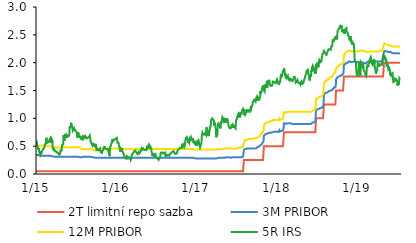
| Category | 2T limitní repo sazba | 3M PRIBOR | 12M PRIBOR | 5R IRS |
|---|---|---|---|---|
| 2015-01-02 | 0.05 | 0.34 | 0.51 | 0.55 |
| 2015-01-05 | 0.05 | 0.34 | 0.51 | 0.57 |
| 2015-01-06 | 0.05 | 0.34 | 0.51 | 0.54 |
| 2015-01-07 | 0.05 | 0.34 | 0.51 | 0.51 |
| 2015-01-08 | 0.05 | 0.34 | 0.51 | 0.52 |
| 2015-01-09 | 0.05 | 0.34 | 0.51 | 0.49 |
| 2015-01-12 | 0.05 | 0.34 | 0.51 | 0.48 |
| 2015-01-13 | 0.05 | 0.33 | 0.51 | 0.44 |
| 2015-01-14 | 0.05 | 0.33 | 0.51 | 0.46 |
| 2015-01-15 | 0.05 | 0.33 | 0.51 | 0.45 |
| 2015-01-16 | 0.05 | 0.33 | 0.51 | 0.4 |
| 2015-01-19 | 0.05 | 0.33 | 0.51 | 0.4 |
| 2015-01-20 | 0.05 | 0.33 | 0.51 | 0.36 |
| 2015-01-21 | 0.05 | 0.33 | 0.51 | 0.38 |
| 2015-01-22 | 0.05 | 0.33 | 0.51 | 0.41 |
| 2015-01-23 | 0.05 | 0.33 | 0.51 | 0.35 |
| 2015-01-26 | 0.05 | 0.33 | 0.51 | 0.36 |
| 2015-01-27 | 0.05 | 0.33 | 0.51 | 0.38 |
| 2015-01-28 | 0.05 | 0.33 | 0.51 | 0.4 |
| 2015-01-29 | 0.05 | 0.33 | 0.51 | 0.41 |
| 2015-01-30 | 0.05 | 0.33 | 0.51 | 0.42 |
| 2015-02-02 | 0.05 | 0.33 | 0.51 | 0.41 |
| 2015-02-03 | 0.05 | 0.33 | 0.51 | 0.41 |
| 2015-02-04 | 0.05 | 0.33 | 0.51 | 0.45 |
| 2015-02-05 | 0.05 | 0.33 | 0.51 | 0.46 |
| 2015-02-06 | 0.05 | 0.33 | 0.51 | 0.46 |
| 2015-02-09 | 0.05 | 0.33 | 0.51 | 0.48 |
| 2015-02-10 | 0.05 | 0.33 | 0.51 | 0.49 |
| 2015-02-11 | 0.05 | 0.33 | 0.51 | 0.53 |
| 2015-02-12 | 0.05 | 0.33 | 0.51 | 0.54 |
| 2015-02-13 | 0.05 | 0.33 | 0.51 | 0.53 |
| 2015-02-16 | 0.05 | 0.33 | 0.51 | 0.55 |
| 2015-02-17 | 0.05 | 0.33 | 0.51 | 0.58 |
| 2015-02-18 | 0.05 | 0.33 | 0.51 | 0.65 |
| 2015-02-19 | 0.05 | 0.33 | 0.51 | 0.55 |
| 2015-02-20 | 0.05 | 0.33 | 0.5 | 0.6 |
| 2015-02-23 | 0.05 | 0.33 | 0.5 | 0.61 |
| 2015-02-24 | 0.05 | 0.33 | 0.5 | 0.61 |
| 2015-02-25 | 0.05 | 0.33 | 0.5 | 0.57 |
| 2015-02-26 | 0.05 | 0.33 | 0.5 | 0.57 |
| 2015-02-27 | 0.05 | 0.33 | 0.5 | 0.57 |
| 2015-03-02 | 0.05 | 0.33 | 0.5 | 0.58 |
| 2015-03-03 | 0.05 | 0.33 | 0.5 | 0.57 |
| 2015-03-04 | 0.05 | 0.33 | 0.5 | 0.62 |
| 2015-03-05 | 0.05 | 0.33 | 0.5 | 0.62 |
| 2015-03-06 | 0.05 | 0.33 | 0.5 | 0.62 |
| 2015-03-09 | 0.05 | 0.33 | 0.5 | 0.65 |
| 2015-03-10 | 0.05 | 0.33 | 0.5 | 0.62 |
| 2015-03-11 | 0.05 | 0.33 | 0.5 | 0.62 |
| 2015-03-12 | 0.05 | 0.33 | 0.5 | 0.56 |
| 2015-03-13 | 0.05 | 0.33 | 0.5 | 0.63 |
| 2015-03-16 | 0.05 | 0.32 | 0.49 | 0.61 |
| 2015-03-17 | 0.05 | 0.32 | 0.49 | 0.59 |
| 2015-03-18 | 0.05 | 0.31 | 0.49 | 0.5 |
| 2015-03-19 | 0.05 | 0.31 | 0.48 | 0.45 |
| 2015-03-20 | 0.05 | 0.31 | 0.48 | 0.44 |
| 2015-03-23 | 0.05 | 0.31 | 0.48 | 0.46 |
| 2015-03-24 | 0.05 | 0.31 | 0.48 | 0.44 |
| 2015-03-25 | 0.05 | 0.31 | 0.48 | 0.43 |
| 2015-03-26 | 0.05 | 0.31 | 0.48 | 0.41 |
| 2015-03-27 | 0.05 | 0.31 | 0.48 | 0.43 |
| 2015-03-30 | 0.05 | 0.31 | 0.48 | 0.41 |
| 2015-03-31 | 0.05 | 0.31 | 0.48 | 0.41 |
| 2015-04-01 | 0.05 | 0.31 | 0.48 | 0.41 |
| 2015-04-02 | 0.05 | 0.31 | 0.48 | 0.4 |
| 2015-04-03 | 0.05 | 0.31 | 0.48 | 0.4 |
| 2015-04-07 | 0.05 | 0.31 | 0.48 | 0.39 |
| 2015-04-08 | 0.05 | 0.31 | 0.48 | 0.39 |
| 2015-04-09 | 0.05 | 0.31 | 0.48 | 0.38 |
| 2015-04-10 | 0.05 | 0.31 | 0.48 | 0.38 |
| 2015-04-13 | 0.05 | 0.31 | 0.48 | 0.37 |
| 2015-04-14 | 0.05 | 0.31 | 0.47 | 0.37 |
| 2015-04-15 | 0.05 | 0.31 | 0.48 | 0.37 |
| 2015-04-16 | 0.05 | 0.31 | 0.47 | 0.35 |
| 2015-04-17 | 0.05 | 0.31 | 0.47 | 0.36 |
| 2015-04-20 | 0.05 | 0.31 | 0.47 | 0.35 |
| 2015-04-21 | 0.05 | 0.31 | 0.47 | 0.36 |
| 2015-04-22 | 0.05 | 0.31 | 0.47 | 0.38 |
| 2015-04-23 | 0.05 | 0.31 | 0.48 | 0.42 |
| 2015-04-24 | 0.05 | 0.31 | 0.47 | 0.42 |
| 2015-04-27 | 0.05 | 0.31 | 0.48 | 0.41 |
| 2015-04-28 | 0.05 | 0.31 | 0.48 | 0.42 |
| 2015-04-29 | 0.05 | 0.31 | 0.48 | 0.47 |
| 2015-04-30 | 0.05 | 0.31 | 0.48 | 0.52 |
| 2015-05-04 | 0.05 | 0.31 | 0.48 | 0.53 |
| 2015-05-05 | 0.05 | 0.31 | 0.48 | 0.53 |
| 2015-05-06 | 0.05 | 0.31 | 0.48 | 0.59 |
| 2015-05-07 | 0.05 | 0.31 | 0.48 | 0.7 |
| 2015-05-11 | 0.05 | 0.31 | 0.48 | 0.6 |
| 2015-05-12 | 0.05 | 0.31 | 0.48 | 0.69 |
| 2015-05-13 | 0.05 | 0.31 | 0.48 | 0.66 |
| 2015-05-14 | 0.05 | 0.31 | 0.48 | 0.72 |
| 2015-05-15 | 0.05 | 0.31 | 0.48 | 0.7 |
| 2015-05-18 | 0.05 | 0.31 | 0.48 | 0.7 |
| 2015-05-19 | 0.05 | 0.31 | 0.48 | 0.65 |
| 2015-05-20 | 0.05 | 0.31 | 0.48 | 0.68 |
| 2015-05-21 | 0.05 | 0.31 | 0.48 | 0.7 |
| 2015-05-22 | 0.05 | 0.31 | 0.48 | 0.7 |
| 2015-05-25 | 0.05 | 0.31 | 0.48 | 0.7 |
| 2015-05-26 | 0.05 | 0.31 | 0.48 | 0.67 |
| 2015-05-27 | 0.05 | 0.31 | 0.48 | 0.67 |
| 2015-05-28 | 0.05 | 0.31 | 0.48 | 0.66 |
| 2015-05-29 | 0.05 | 0.31 | 0.48 | 0.68 |
| 2015-06-01 | 0.05 | 0.31 | 0.48 | 0.69 |
| 2015-06-02 | 0.05 | 0.31 | 0.48 | 0.72 |
| 2015-06-03 | 0.05 | 0.31 | 0.48 | 0.75 |
| 2015-06-04 | 0.05 | 0.31 | 0.48 | 0.86 |
| 2015-06-05 | 0.05 | 0.31 | 0.48 | 0.84 |
| 2015-06-08 | 0.05 | 0.31 | 0.48 | 0.84 |
| 2015-06-09 | 0.05 | 0.31 | 0.48 | 0.86 |
| 2015-06-10 | 0.05 | 0.31 | 0.48 | 0.92 |
| 2015-06-11 | 0.05 | 0.31 | 0.48 | 0.92 |
| 2015-06-12 | 0.05 | 0.31 | 0.48 | 0.89 |
| 2015-06-15 | 0.05 | 0.31 | 0.48 | 0.85 |
| 2015-06-16 | 0.05 | 0.31 | 0.48 | 0.82 |
| 2015-06-17 | 0.05 | 0.31 | 0.48 | 0.82 |
| 2015-06-18 | 0.05 | 0.31 | 0.48 | 0.78 |
| 2015-06-19 | 0.05 | 0.31 | 0.48 | 0.77 |
| 2015-06-22 | 0.05 | 0.31 | 0.48 | 0.79 |
| 2015-06-23 | 0.05 | 0.31 | 0.48 | 0.82 |
| 2015-06-24 | 0.05 | 0.31 | 0.48 | 0.8 |
| 2015-06-25 | 0.05 | 0.31 | 0.48 | 0.78 |
| 2015-06-26 | 0.05 | 0.31 | 0.48 | 0.8 |
| 2015-06-29 | 0.05 | 0.31 | 0.48 | 0.8 |
| 2015-06-30 | 0.05 | 0.31 | 0.48 | 0.78 |
| 2015-07-01 | 0.05 | 0.31 | 0.48 | 0.79 |
| 2015-07-02 | 0.05 | 0.31 | 0.48 | 0.79 |
| 2015-07-03 | 0.05 | 0.31 | 0.48 | 0.78 |
| 2015-07-07 | 0.05 | 0.31 | 0.48 | 0.74 |
| 2015-07-08 | 0.05 | 0.31 | 0.47 | 0.68 |
| 2015-07-09 | 0.05 | 0.31 | 0.47 | 0.65 |
| 2015-07-10 | 0.05 | 0.31 | 0.47 | 0.7 |
| 2015-07-13 | 0.05 | 0.31 | 0.48 | 0.75 |
| 2015-07-14 | 0.05 | 0.31 | 0.48 | 0.68 |
| 2015-07-15 | 0.05 | 0.3 | 0.48 | 0.69 |
| 2015-07-16 | 0.05 | 0.3 | 0.48 | 0.67 |
| 2015-07-17 | 0.05 | 0.3 | 0.48 | 0.69 |
| 2015-07-20 | 0.05 | 0.3 | 0.48 | 0.68 |
| 2015-07-21 | 0.05 | 0.3 | 0.48 | 0.66 |
| 2015-07-22 | 0.05 | 0.31 | 0.48 | 0.67 |
| 2015-07-23 | 0.05 | 0.31 | 0.48 | 0.67 |
| 2015-07-24 | 0.05 | 0.3 | 0.48 | 0.64 |
| 2015-07-27 | 0.05 | 0.3 | 0.45 | 0.63 |
| 2015-07-28 | 0.05 | 0.3 | 0.45 | 0.63 |
| 2015-07-29 | 0.05 | 0.3 | 0.45 | 0.66 |
| 2015-07-30 | 0.05 | 0.3 | 0.45 | 0.62 |
| 2015-07-31 | 0.05 | 0.31 | 0.45 | 0.62 |
| 2015-08-03 | 0.05 | 0.31 | 0.45 | 0.62 |
| 2015-08-04 | 0.05 | 0.31 | 0.45 | 0.62 |
| 2015-08-05 | 0.05 | 0.31 | 0.45 | 0.64 |
| 2015-08-06 | 0.05 | 0.31 | 0.45 | 0.68 |
| 2015-08-07 | 0.05 | 0.31 | 0.45 | 0.68 |
| 2015-08-10 | 0.05 | 0.31 | 0.45 | 0.68 |
| 2015-08-11 | 0.05 | 0.31 | 0.45 | 0.67 |
| 2015-08-12 | 0.05 | 0.31 | 0.45 | 0.64 |
| 2015-08-13 | 0.05 | 0.31 | 0.45 | 0.65 |
| 2015-08-14 | 0.05 | 0.31 | 0.45 | 0.68 |
| 2015-08-17 | 0.05 | 0.31 | 0.45 | 0.67 |
| 2015-08-18 | 0.05 | 0.31 | 0.45 | 0.66 |
| 2015-08-19 | 0.05 | 0.31 | 0.45 | 0.65 |
| 2015-08-20 | 0.05 | 0.31 | 0.45 | 0.64 |
| 2015-08-21 | 0.05 | 0.31 | 0.45 | 0.64 |
| 2015-08-24 | 0.05 | 0.31 | 0.45 | 0.63 |
| 2015-08-25 | 0.05 | 0.31 | 0.45 | 0.65 |
| 2015-08-26 | 0.05 | 0.31 | 0.45 | 0.65 |
| 2015-08-27 | 0.05 | 0.31 | 0.45 | 0.66 |
| 2015-08-28 | 0.05 | 0.31 | 0.45 | 0.66 |
| 2015-08-31 | 0.05 | 0.31 | 0.45 | 0.67 |
| 2015-09-01 | 0.05 | 0.31 | 0.45 | 0.68 |
| 2015-09-02 | 0.05 | 0.31 | 0.45 | 0.68 |
| 2015-09-03 | 0.05 | 0.31 | 0.45 | 0.69 |
| 2015-09-04 | 0.05 | 0.31 | 0.45 | 0.65 |
| 2015-09-07 | 0.05 | 0.31 | 0.45 | 0.6 |
| 2015-09-08 | 0.05 | 0.3 | 0.44 | 0.57 |
| 2015-09-09 | 0.05 | 0.3 | 0.44 | 0.57 |
| 2015-09-10 | 0.05 | 0.3 | 0.44 | 0.57 |
| 2015-09-11 | 0.05 | 0.3 | 0.44 | 0.56 |
| 2015-09-14 | 0.05 | 0.3 | 0.44 | 0.52 |
| 2015-09-15 | 0.05 | 0.3 | 0.44 | 0.54 |
| 2015-09-16 | 0.05 | 0.31 | 0.44 | 0.56 |
| 2015-09-17 | 0.05 | 0.31 | 0.44 | 0.57 |
| 2015-09-18 | 0.05 | 0.31 | 0.44 | 0.53 |
| 2015-09-21 | 0.05 | 0.3 | 0.43 | 0.53 |
| 2015-09-22 | 0.05 | 0.3 | 0.43 | 0.51 |
| 2015-09-23 | 0.05 | 0.3 | 0.43 | 0.53 |
| 2015-09-24 | 0.05 | 0.3 | 0.43 | 0.53 |
| 2015-09-25 | 0.05 | 0.29 | 0.42 | 0.53 |
| 2015-09-29 | 0.05 | 0.29 | 0.42 | 0.53 |
| 2015-09-30 | 0.05 | 0.29 | 0.42 | 0.48 |
| 2015-10-01 | 0.05 | 0.29 | 0.42 | 0.53 |
| 2015-10-02 | 0.05 | 0.29 | 0.42 | 0.53 |
| 2015-10-05 | 0.05 | 0.29 | 0.42 | 0.42 |
| 2015-10-06 | 0.05 | 0.29 | 0.42 | 0.46 |
| 2015-10-07 | 0.05 | 0.29 | 0.42 | 0.46 |
| 2015-10-08 | 0.05 | 0.29 | 0.42 | 0.44 |
| 2015-10-09 | 0.05 | 0.29 | 0.42 | 0.44 |
| 2015-10-12 | 0.05 | 0.29 | 0.42 | 0.45 |
| 2015-10-13 | 0.05 | 0.29 | 0.42 | 0.43 |
| 2015-10-14 | 0.05 | 0.29 | 0.42 | 0.43 |
| 2015-10-15 | 0.05 | 0.29 | 0.42 | 0.43 |
| 2015-10-16 | 0.05 | 0.29 | 0.42 | 0.44 |
| 2015-10-19 | 0.05 | 0.29 | 0.42 | 0.46 |
| 2015-10-20 | 0.05 | 0.29 | 0.42 | 0.44 |
| 2015-10-21 | 0.05 | 0.29 | 0.42 | 0.45 |
| 2015-10-22 | 0.05 | 0.29 | 0.42 | 0.42 |
| 2015-10-23 | 0.05 | 0.29 | 0.42 | 0.39 |
| 2015-10-26 | 0.05 | 0.29 | 0.46 | 0.4 |
| 2015-10-27 | 0.05 | 0.29 | 0.45 | 0.38 |
| 2015-10-29 | 0.05 | 0.29 | 0.45 | 0.38 |
| 2015-10-30 | 0.05 | 0.29 | 0.45 | 0.41 |
| 2015-11-02 | 0.05 | 0.29 | 0.45 | 0.43 |
| 2015-11-03 | 0.05 | 0.29 | 0.46 | 0.44 |
| 2015-11-04 | 0.05 | 0.29 | 0.46 | 0.44 |
| 2015-11-05 | 0.05 | 0.29 | 0.46 | 0.44 |
| 2015-11-06 | 0.05 | 0.29 | 0.45 | 0.44 |
| 2015-11-09 | 0.05 | 0.29 | 0.46 | 0.5 |
| 2015-11-10 | 0.05 | 0.29 | 0.46 | 0.46 |
| 2015-11-11 | 0.05 | 0.29 | 0.46 | 0.46 |
| 2015-11-12 | 0.05 | 0.29 | 0.46 | 0.45 |
| 2015-11-13 | 0.05 | 0.29 | 0.46 | 0.46 |
| 2015-11-16 | 0.05 | 0.29 | 0.46 | 0.45 |
| 2015-11-18 | 0.05 | 0.29 | 0.46 | 0.45 |
| 2015-11-19 | 0.05 | 0.29 | 0.46 | 0.44 |
| 2015-11-20 | 0.05 | 0.29 | 0.46 | 0.44 |
| 2015-11-23 | 0.05 | 0.29 | 0.46 | 0.44 |
| 2015-11-24 | 0.05 | 0.29 | 0.46 | 0.44 |
| 2015-11-25 | 0.05 | 0.29 | 0.46 | 0.46 |
| 2015-11-26 | 0.05 | 0.29 | 0.46 | 0.42 |
| 2015-11-27 | 0.05 | 0.29 | 0.45 | 0.42 |
| 2015-11-30 | 0.05 | 0.29 | 0.45 | 0.36 |
| 2015-12-01 | 0.05 | 0.28 | 0.45 | 0.37 |
| 2015-12-02 | 0.05 | 0.28 | 0.45 | 0.32 |
| 2015-12-03 | 0.05 | 0.28 | 0.45 | 0.34 |
| 2015-12-04 | 0.05 | 0.29 | 0.46 | 0.48 |
| 2015-12-07 | 0.05 | 0.29 | 0.46 | 0.5 |
| 2015-12-08 | 0.05 | 0.29 | 0.46 | 0.49 |
| 2015-12-09 | 0.05 | 0.29 | 0.46 | 0.51 |
| 2015-12-10 | 0.05 | 0.29 | 0.46 | 0.54 |
| 2015-12-11 | 0.05 | 0.29 | 0.46 | 0.53 |
| 2015-12-14 | 0.05 | 0.29 | 0.46 | 0.55 |
| 2015-12-15 | 0.05 | 0.29 | 0.46 | 0.61 |
| 2015-12-16 | 0.05 | 0.29 | 0.46 | 0.63 |
| 2015-12-17 | 0.05 | 0.29 | 0.46 | 0.62 |
| 2015-12-18 | 0.05 | 0.29 | 0.46 | 0.59 |
| 2015-12-21 | 0.05 | 0.29 | 0.46 | 0.59 |
| 2015-12-22 | 0.05 | 0.29 | 0.46 | 0.59 |
| 2015-12-23 | 0.05 | 0.29 | 0.46 | 0.61 |
| 2015-12-28 | 0.05 | 0.29 | 0.46 | 0.63 |
| 2015-12-29 | 0.05 | 0.29 | 0.46 | 0.63 |
| 2015-12-30 | 0.05 | 0.29 | 0.46 | 0.64 |
| 2015-12-31 | 0.05 | 0.29 | 0.46 | 0.64 |
| 2016-01-04 | 0.05 | 0.29 | 0.46 | 0.65 |
| 2016-01-05 | 0.05 | 0.29 | 0.46 | 0.63 |
| 2016-01-06 | 0.05 | 0.29 | 0.46 | 0.62 |
| 2016-01-07 | 0.05 | 0.29 | 0.46 | 0.56 |
| 2016-01-08 | 0.05 | 0.29 | 0.46 | 0.57 |
| 2016-01-11 | 0.05 | 0.29 | 0.45 | 0.56 |
| 2016-01-12 | 0.05 | 0.29 | 0.45 | 0.56 |
| 2016-01-13 | 0.05 | 0.29 | 0.45 | 0.56 |
| 2016-01-14 | 0.05 | 0.29 | 0.45 | 0.5 |
| 2016-01-15 | 0.05 | 0.29 | 0.45 | 0.49 |
| 2016-01-18 | 0.05 | 0.29 | 0.45 | 0.46 |
| 2016-01-19 | 0.05 | 0.29 | 0.45 | 0.46 |
| 2016-01-20 | 0.05 | 0.29 | 0.45 | 0.4 |
| 2016-01-21 | 0.05 | 0.29 | 0.45 | 0.43 |
| 2016-01-22 | 0.05 | 0.29 | 0.45 | 0.46 |
| 2016-01-25 | 0.05 | 0.29 | 0.45 | 0.45 |
| 2016-01-26 | 0.05 | 0.29 | 0.45 | 0.44 |
| 2016-01-27 | 0.05 | 0.29 | 0.45 | 0.46 |
| 2016-01-28 | 0.05 | 0.29 | 0.45 | 0.44 |
| 2016-01-29 | 0.05 | 0.29 | 0.45 | 0.41 |
| 2016-02-01 | 0.05 | 0.29 | 0.45 | 0.4 |
| 2016-02-02 | 0.05 | 0.29 | 0.45 | 0.38 |
| 2016-02-03 | 0.05 | 0.29 | 0.45 | 0.37 |
| 2016-02-04 | 0.05 | 0.29 | 0.45 | 0.37 |
| 2016-02-05 | 0.05 | 0.29 | 0.45 | 0.34 |
| 2016-02-08 | 0.05 | 0.29 | 0.45 | 0.32 |
| 2016-02-09 | 0.05 | 0.28 | 0.45 | 0.31 |
| 2016-02-10 | 0.05 | 0.28 | 0.45 | 0.31 |
| 2016-02-11 | 0.05 | 0.28 | 0.45 | 0.29 |
| 2016-02-12 | 0.05 | 0.28 | 0.45 | 0.28 |
| 2016-02-15 | 0.05 | 0.28 | 0.45 | 0.28 |
| 2016-02-16 | 0.05 | 0.28 | 0.45 | 0.28 |
| 2016-02-17 | 0.05 | 0.28 | 0.45 | 0.28 |
| 2016-02-18 | 0.05 | 0.28 | 0.45 | 0.3 |
| 2016-02-19 | 0.05 | 0.28 | 0.45 | 0.32 |
| 2016-02-22 | 0.05 | 0.28 | 0.45 | 0.32 |
| 2016-02-23 | 0.05 | 0.28 | 0.45 | 0.32 |
| 2016-02-24 | 0.05 | 0.28 | 0.45 | 0.3 |
| 2016-02-25 | 0.05 | 0.28 | 0.45 | 0.3 |
| 2016-02-26 | 0.05 | 0.28 | 0.45 | 0.31 |
| 2016-02-29 | 0.05 | 0.28 | 0.45 | 0.3 |
| 2016-03-01 | 0.05 | 0.28 | 0.45 | 0.29 |
| 2016-03-02 | 0.05 | 0.28 | 0.45 | 0.31 |
| 2016-03-03 | 0.05 | 0.28 | 0.45 | 0.3 |
| 2016-03-04 | 0.05 | 0.28 | 0.45 | 0.29 |
| 2016-03-07 | 0.05 | 0.28 | 0.45 | 0.28 |
| 2016-03-08 | 0.05 | 0.28 | 0.45 | 0.26 |
| 2016-03-09 | 0.05 | 0.28 | 0.45 | 0.26 |
| 2016-03-10 | 0.05 | 0.28 | 0.45 | 0.28 |
| 2016-03-11 | 0.05 | 0.29 | 0.45 | 0.33 |
| 2016-03-14 | 0.05 | 0.29 | 0.45 | 0.34 |
| 2016-03-15 | 0.05 | 0.29 | 0.45 | 0.36 |
| 2016-03-16 | 0.05 | 0.29 | 0.45 | 0.37 |
| 2016-03-17 | 0.05 | 0.29 | 0.45 | 0.37 |
| 2016-03-18 | 0.05 | 0.29 | 0.45 | 0.37 |
| 2016-03-21 | 0.05 | 0.29 | 0.45 | 0.39 |
| 2016-03-22 | 0.05 | 0.29 | 0.45 | 0.41 |
| 2016-03-23 | 0.05 | 0.29 | 0.45 | 0.41 |
| 2016-03-24 | 0.05 | 0.29 | 0.45 | 0.4 |
| 2016-03-29 | 0.05 | 0.29 | 0.45 | 0.42 |
| 2016-03-30 | 0.05 | 0.29 | 0.45 | 0.4 |
| 2016-03-31 | 0.05 | 0.29 | 0.45 | 0.4 |
| 2016-04-01 | 0.05 | 0.29 | 0.45 | 0.4 |
| 2016-04-04 | 0.05 | 0.29 | 0.45 | 0.38 |
| 2016-04-05 | 0.05 | 0.29 | 0.45 | 0.37 |
| 2016-04-06 | 0.05 | 0.29 | 0.45 | 0.38 |
| 2016-04-07 | 0.05 | 0.29 | 0.45 | 0.36 |
| 2016-04-08 | 0.05 | 0.29 | 0.45 | 0.36 |
| 2016-04-11 | 0.05 | 0.29 | 0.45 | 0.35 |
| 2016-04-12 | 0.05 | 0.29 | 0.45 | 0.39 |
| 2016-04-13 | 0.05 | 0.29 | 0.45 | 0.37 |
| 2016-04-14 | 0.05 | 0.29 | 0.45 | 0.39 |
| 2016-04-15 | 0.05 | 0.29 | 0.45 | 0.37 |
| 2016-04-18 | 0.05 | 0.29 | 0.45 | 0.37 |
| 2016-04-19 | 0.05 | 0.29 | 0.45 | 0.39 |
| 2016-04-20 | 0.05 | 0.29 | 0.45 | 0.38 |
| 2016-04-21 | 0.05 | 0.29 | 0.45 | 0.41 |
| 2016-04-22 | 0.05 | 0.29 | 0.45 | 0.41 |
| 2016-04-25 | 0.05 | 0.29 | 0.45 | 0.42 |
| 2016-04-26 | 0.05 | 0.29 | 0.45 | 0.46 |
| 2016-04-27 | 0.05 | 0.29 | 0.45 | 0.46 |
| 2016-04-28 | 0.05 | 0.29 | 0.45 | 0.44 |
| 2016-04-29 | 0.05 | 0.29 | 0.45 | 0.45 |
| 2016-05-02 | 0.05 | 0.29 | 0.45 | 0.46 |
| 2016-05-03 | 0.05 | 0.29 | 0.45 | 0.46 |
| 2016-05-04 | 0.05 | 0.29 | 0.45 | 0.44 |
| 2016-05-05 | 0.05 | 0.29 | 0.45 | 0.45 |
| 2016-05-06 | 0.05 | 0.29 | 0.45 | 0.44 |
| 2016-05-09 | 0.05 | 0.29 | 0.45 | 0.43 |
| 2016-05-10 | 0.05 | 0.29 | 0.45 | 0.44 |
| 2016-05-11 | 0.05 | 0.29 | 0.45 | 0.43 |
| 2016-05-12 | 0.05 | 0.29 | 0.45 | 0.42 |
| 2016-05-13 | 0.05 | 0.29 | 0.45 | 0.43 |
| 2016-05-16 | 0.05 | 0.29 | 0.45 | 0.43 |
| 2016-05-17 | 0.05 | 0.29 | 0.45 | 0.44 |
| 2016-05-18 | 0.05 | 0.29 | 0.45 | 0.44 |
| 2016-05-19 | 0.05 | 0.29 | 0.45 | 0.46 |
| 2016-05-20 | 0.05 | 0.29 | 0.45 | 0.48 |
| 2016-05-23 | 0.05 | 0.29 | 0.45 | 0.46 |
| 2016-05-24 | 0.05 | 0.29 | 0.45 | 0.46 |
| 2016-05-25 | 0.05 | 0.29 | 0.45 | 0.48 |
| 2016-05-26 | 0.05 | 0.29 | 0.45 | 0.48 |
| 2016-05-27 | 0.05 | 0.29 | 0.45 | 0.51 |
| 2016-05-30 | 0.05 | 0.29 | 0.45 | 0.49 |
| 2016-05-31 | 0.05 | 0.29 | 0.45 | 0.52 |
| 2016-06-01 | 0.05 | 0.29 | 0.45 | 0.51 |
| 2016-06-02 | 0.05 | 0.29 | 0.45 | 0.51 |
| 2016-06-03 | 0.05 | 0.29 | 0.45 | 0.51 |
| 2016-06-06 | 0.05 | 0.29 | 0.45 | 0.48 |
| 2016-06-07 | 0.05 | 0.29 | 0.45 | 0.49 |
| 2016-06-08 | 0.05 | 0.29 | 0.45 | 0.47 |
| 2016-06-09 | 0.05 | 0.29 | 0.45 | 0.45 |
| 2016-06-10 | 0.05 | 0.29 | 0.45 | 0.39 |
| 2016-06-13 | 0.05 | 0.29 | 0.45 | 0.37 |
| 2016-06-14 | 0.05 | 0.29 | 0.45 | 0.32 |
| 2016-06-15 | 0.05 | 0.29 | 0.45 | 0.32 |
| 2016-06-16 | 0.05 | 0.29 | 0.45 | 0.32 |
| 2016-06-17 | 0.05 | 0.29 | 0.45 | 0.35 |
| 2016-06-20 | 0.05 | 0.29 | 0.45 | 0.35 |
| 2016-06-21 | 0.05 | 0.29 | 0.45 | 0.36 |
| 2016-06-22 | 0.05 | 0.29 | 0.45 | 0.36 |
| 2016-06-23 | 0.05 | 0.29 | 0.45 | 0.36 |
| 2016-06-24 | 0.05 | 0.29 | 0.45 | 0.33 |
| 2016-06-27 | 0.05 | 0.29 | 0.45 | 0.32 |
| 2016-06-28 | 0.05 | 0.29 | 0.45 | 0.35 |
| 2016-06-29 | 0.05 | 0.29 | 0.45 | 0.33 |
| 2016-06-30 | 0.05 | 0.29 | 0.45 | 0.31 |
| 2016-07-01 | 0.05 | 0.29 | 0.45 | 0.31 |
| 2016-07-04 | 0.05 | 0.29 | 0.45 | 0.29 |
| 2016-07-07 | 0.05 | 0.29 | 0.45 | 0.28 |
| 2016-07-08 | 0.05 | 0.29 | 0.45 | 0.28 |
| 2016-07-11 | 0.05 | 0.29 | 0.45 | 0.26 |
| 2016-07-12 | 0.05 | 0.29 | 0.45 | 0.3 |
| 2016-07-13 | 0.05 | 0.29 | 0.45 | 0.29 |
| 2016-07-14 | 0.05 | 0.29 | 0.45 | 0.27 |
| 2016-07-15 | 0.05 | 0.29 | 0.45 | 0.28 |
| 2016-07-18 | 0.05 | 0.29 | 0.45 | 0.29 |
| 2016-07-19 | 0.05 | 0.29 | 0.45 | 0.28 |
| 2016-07-20 | 0.05 | 0.29 | 0.45 | 0.32 |
| 2016-07-21 | 0.05 | 0.29 | 0.45 | 0.36 |
| 2016-07-22 | 0.05 | 0.29 | 0.45 | 0.38 |
| 2016-07-25 | 0.05 | 0.29 | 0.45 | 0.38 |
| 2016-07-26 | 0.05 | 0.29 | 0.45 | 0.38 |
| 2016-07-27 | 0.05 | 0.29 | 0.45 | 0.39 |
| 2016-07-28 | 0.05 | 0.29 | 0.45 | 0.38 |
| 2016-07-29 | 0.05 | 0.29 | 0.45 | 0.38 |
| 2016-08-01 | 0.05 | 0.29 | 0.45 | 0.37 |
| 2016-08-02 | 0.05 | 0.29 | 0.45 | 0.37 |
| 2016-08-03 | 0.05 | 0.29 | 0.45 | 0.37 |
| 2016-08-04 | 0.05 | 0.29 | 0.45 | 0.38 |
| 2016-08-05 | 0.05 | 0.29 | 0.45 | 0.38 |
| 2016-08-08 | 0.05 | 0.29 | 0.45 | 0.38 |
| 2016-08-09 | 0.05 | 0.29 | 0.45 | 0.37 |
| 2016-08-10 | 0.05 | 0.29 | 0.45 | 0.37 |
| 2016-08-11 | 0.05 | 0.29 | 0.45 | 0.35 |
| 2016-08-12 | 0.05 | 0.29 | 0.45 | 0.37 |
| 2016-08-15 | 0.05 | 0.29 | 0.45 | 0.34 |
| 2016-08-16 | 0.05 | 0.29 | 0.45 | 0.32 |
| 2016-08-17 | 0.05 | 0.29 | 0.45 | 0.33 |
| 2016-08-18 | 0.05 | 0.29 | 0.45 | 0.33 |
| 2016-08-19 | 0.05 | 0.29 | 0.45 | 0.33 |
| 2016-08-22 | 0.05 | 0.29 | 0.45 | 0.34 |
| 2016-08-23 | 0.05 | 0.29 | 0.45 | 0.33 |
| 2016-08-24 | 0.05 | 0.29 | 0.45 | 0.33 |
| 2016-08-25 | 0.05 | 0.29 | 0.45 | 0.33 |
| 2016-08-26 | 0.05 | 0.29 | 0.45 | 0.33 |
| 2016-08-29 | 0.05 | 0.29 | 0.45 | 0.33 |
| 2016-08-30 | 0.05 | 0.29 | 0.45 | 0.33 |
| 2016-08-31 | 0.05 | 0.29 | 0.45 | 0.34 |
| 2016-09-01 | 0.05 | 0.29 | 0.45 | 0.36 |
| 2016-09-02 | 0.05 | 0.29 | 0.45 | 0.36 |
| 2016-09-05 | 0.05 | 0.29 | 0.45 | 0.37 |
| 2016-09-06 | 0.05 | 0.29 | 0.45 | 0.37 |
| 2016-09-07 | 0.05 | 0.29 | 0.45 | 0.36 |
| 2016-09-08 | 0.05 | 0.29 | 0.45 | 0.36 |
| 2016-09-09 | 0.05 | 0.29 | 0.45 | 0.38 |
| 2016-09-12 | 0.05 | 0.29 | 0.45 | 0.4 |
| 2016-09-13 | 0.05 | 0.29 | 0.45 | 0.4 |
| 2016-09-14 | 0.05 | 0.29 | 0.45 | 0.4 |
| 2016-09-15 | 0.05 | 0.29 | 0.45 | 0.41 |
| 2016-09-16 | 0.05 | 0.29 | 0.45 | 0.41 |
| 2016-09-19 | 0.05 | 0.29 | 0.45 | 0.41 |
| 2016-09-20 | 0.05 | 0.29 | 0.45 | 0.41 |
| 2016-09-21 | 0.05 | 0.29 | 0.45 | 0.39 |
| 2016-09-22 | 0.05 | 0.29 | 0.45 | 0.38 |
| 2016-09-23 | 0.05 | 0.29 | 0.45 | 0.37 |
| 2016-09-26 | 0.05 | 0.29 | 0.45 | 0.36 |
| 2016-09-27 | 0.05 | 0.29 | 0.45 | 0.36 |
| 2016-09-29 | 0.05 | 0.29 | 0.45 | 0.36 |
| 2016-09-30 | 0.05 | 0.29 | 0.45 | 0.36 |
| 2016-10-03 | 0.05 | 0.29 | 0.45 | 0.37 |
| 2016-10-04 | 0.05 | 0.29 | 0.45 | 0.38 |
| 2016-10-05 | 0.05 | 0.29 | 0.45 | 0.39 |
| 2016-10-06 | 0.05 | 0.29 | 0.45 | 0.42 |
| 2016-10-07 | 0.05 | 0.29 | 0.45 | 0.42 |
| 2016-10-10 | 0.05 | 0.29 | 0.45 | 0.43 |
| 2016-10-11 | 0.05 | 0.29 | 0.45 | 0.44 |
| 2016-10-12 | 0.05 | 0.29 | 0.45 | 0.44 |
| 2016-10-13 | 0.05 | 0.29 | 0.45 | 0.45 |
| 2016-10-14 | 0.05 | 0.29 | 0.45 | 0.45 |
| 2016-10-17 | 0.05 | 0.29 | 0.45 | 0.47 |
| 2016-10-18 | 0.05 | 0.29 | 0.45 | 0.47 |
| 2016-10-19 | 0.05 | 0.29 | 0.45 | 0.47 |
| 2016-10-20 | 0.05 | 0.29 | 0.45 | 0.48 |
| 2016-10-21 | 0.05 | 0.29 | 0.45 | 0.48 |
| 2016-10-24 | 0.05 | 0.29 | 0.45 | 0.48 |
| 2016-10-25 | 0.05 | 0.29 | 0.45 | 0.46 |
| 2016-10-26 | 0.05 | 0.29 | 0.45 | 0.48 |
| 2016-10-27 | 0.05 | 0.29 | 0.45 | 0.53 |
| 2016-10-31 | 0.05 | 0.29 | 0.45 | 0.54 |
| 2016-11-01 | 0.05 | 0.29 | 0.45 | 0.53 |
| 2016-11-02 | 0.05 | 0.29 | 0.45 | 0.51 |
| 2016-11-03 | 0.05 | 0.29 | 0.45 | 0.52 |
| 2016-11-04 | 0.05 | 0.29 | 0.45 | 0.53 |
| 2016-11-07 | 0.05 | 0.29 | 0.45 | 0.5 |
| 2016-11-08 | 0.05 | 0.29 | 0.45 | 0.49 |
| 2016-11-09 | 0.05 | 0.29 | 0.45 | 0.51 |
| 2016-11-10 | 0.05 | 0.29 | 0.45 | 0.55 |
| 2016-11-11 | 0.05 | 0.29 | 0.45 | 0.61 |
| 2016-11-14 | 0.05 | 0.29 | 0.45 | 0.66 |
| 2016-11-15 | 0.05 | 0.29 | 0.45 | 0.64 |
| 2016-11-16 | 0.05 | 0.29 | 0.45 | 0.65 |
| 2016-11-18 | 0.05 | 0.29 | 0.45 | 0.66 |
| 2016-11-21 | 0.05 | 0.29 | 0.45 | 0.63 |
| 2016-11-22 | 0.05 | 0.29 | 0.45 | 0.6 |
| 2016-11-23 | 0.05 | 0.29 | 0.45 | 0.56 |
| 2016-11-24 | 0.05 | 0.29 | 0.45 | 0.59 |
| 2016-11-25 | 0.05 | 0.29 | 0.45 | 0.59 |
| 2016-11-28 | 0.05 | 0.29 | 0.45 | 0.56 |
| 2016-11-29 | 0.05 | 0.29 | 0.45 | 0.56 |
| 2016-11-30 | 0.05 | 0.29 | 0.45 | 0.57 |
| 2016-12-01 | 0.05 | 0.29 | 0.45 | 0.64 |
| 2016-12-02 | 0.05 | 0.29 | 0.45 | 0.63 |
| 2016-12-05 | 0.05 | 0.29 | 0.45 | 0.62 |
| 2016-12-06 | 0.05 | 0.29 | 0.45 | 0.64 |
| 2016-12-07 | 0.05 | 0.29 | 0.45 | 0.66 |
| 2016-12-08 | 0.05 | 0.29 | 0.45 | 0.66 |
| 2016-12-09 | 0.05 | 0.29 | 0.45 | 0.64 |
| 2016-12-12 | 0.05 | 0.29 | 0.45 | 0.65 |
| 2016-12-13 | 0.05 | 0.29 | 0.45 | 0.63 |
| 2016-12-14 | 0.05 | 0.29 | 0.45 | 0.6 |
| 2016-12-15 | 0.05 | 0.29 | 0.45 | 0.64 |
| 2016-12-16 | 0.05 | 0.29 | 0.45 | 0.62 |
| 2016-12-19 | 0.05 | 0.29 | 0.44 | 0.59 |
| 2016-12-20 | 0.05 | 0.29 | 0.44 | 0.57 |
| 2016-12-21 | 0.05 | 0.29 | 0.44 | 0.56 |
| 2016-12-22 | 0.05 | 0.28 | 0.44 | 0.57 |
| 2016-12-23 | 0.05 | 0.28 | 0.44 | 0.55 |
| 2016-12-27 | 0.05 | 0.28 | 0.44 | 0.57 |
| 2016-12-28 | 0.05 | 0.27 | 0.43 | 0.54 |
| 2016-12-29 | 0.05 | 0.28 | 0.44 | 0.52 |
| 2016-12-30 | 0.05 | 0.28 | 0.44 | 0.52 |
| 2017-01-02 | 0.05 | 0.28 | 0.44 | 0.52 |
| 2017-01-03 | 0.05 | 0.28 | 0.44 | 0.52 |
| 2017-01-04 | 0.05 | 0.28 | 0.44 | 0.57 |
| 2017-01-05 | 0.05 | 0.28 | 0.44 | 0.59 |
| 2017-01-06 | 0.05 | 0.28 | 0.44 | 0.58 |
| 2017-01-09 | 0.05 | 0.28 | 0.44 | 0.61 |
| 2017-01-10 | 0.05 | 0.28 | 0.44 | 0.6 |
| 2017-01-11 | 0.05 | 0.28 | 0.44 | 0.59 |
| 2017-01-12 | 0.05 | 0.28 | 0.44 | 0.56 |
| 2017-01-13 | 0.05 | 0.28 | 0.44 | 0.52 |
| 2017-01-16 | 0.05 | 0.28 | 0.44 | 0.5 |
| 2017-01-17 | 0.05 | 0.28 | 0.44 | 0.48 |
| 2017-01-18 | 0.05 | 0.28 | 0.44 | 0.48 |
| 2017-01-19 | 0.05 | 0.28 | 0.44 | 0.5 |
| 2017-01-20 | 0.05 | 0.28 | 0.44 | 0.53 |
| 2017-01-23 | 0.05 | 0.28 | 0.44 | 0.56 |
| 2017-01-24 | 0.05 | 0.28 | 0.44 | 0.62 |
| 2017-01-25 | 0.05 | 0.28 | 0.44 | 0.7 |
| 2017-01-26 | 0.05 | 0.28 | 0.44 | 0.7 |
| 2017-01-27 | 0.05 | 0.28 | 0.44 | 0.74 |
| 2017-01-30 | 0.05 | 0.28 | 0.44 | 0.71 |
| 2017-01-31 | 0.05 | 0.28 | 0.44 | 0.71 |
| 2017-02-01 | 0.05 | 0.28 | 0.44 | 0.7 |
| 2017-02-02 | 0.05 | 0.28 | 0.44 | 0.72 |
| 2017-02-03 | 0.05 | 0.28 | 0.44 | 0.71 |
| 2017-02-06 | 0.05 | 0.28 | 0.44 | 0.71 |
| 2017-02-07 | 0.05 | 0.28 | 0.44 | 0.74 |
| 2017-02-08 | 0.05 | 0.28 | 0.44 | 0.75 |
| 2017-02-09 | 0.05 | 0.28 | 0.44 | 0.7 |
| 2017-02-10 | 0.05 | 0.28 | 0.44 | 0.72 |
| 2017-02-13 | 0.05 | 0.28 | 0.44 | 0.7 |
| 2017-02-14 | 0.05 | 0.28 | 0.44 | 0.77 |
| 2017-02-15 | 0.05 | 0.28 | 0.44 | 0.84 |
| 2017-02-16 | 0.05 | 0.28 | 0.44 | 0.83 |
| 2017-02-17 | 0.05 | 0.28 | 0.44 | 0.76 |
| 2017-02-20 | 0.05 | 0.28 | 0.44 | 0.79 |
| 2017-02-21 | 0.05 | 0.28 | 0.44 | 0.8 |
| 2017-02-22 | 0.05 | 0.28 | 0.44 | 0.78 |
| 2017-02-23 | 0.05 | 0.28 | 0.44 | 0.7 |
| 2017-02-24 | 0.05 | 0.28 | 0.44 | 0.68 |
| 2017-02-27 | 0.05 | 0.28 | 0.44 | 0.68 |
| 2017-02-28 | 0.05 | 0.28 | 0.44 | 0.77 |
| 2017-03-01 | 0.05 | 0.28 | 0.44 | 0.77 |
| 2017-03-02 | 0.05 | 0.28 | 0.44 | 0.85 |
| 2017-03-03 | 0.05 | 0.28 | 0.44 | 0.83 |
| 2017-03-06 | 0.05 | 0.28 | 0.44 | 0.86 |
| 2017-03-07 | 0.05 | 0.28 | 0.44 | 0.87 |
| 2017-03-08 | 0.05 | 0.28 | 0.44 | 0.96 |
| 2017-03-09 | 0.05 | 0.28 | 0.44 | 0.98 |
| 2017-03-10 | 0.05 | 0.28 | 0.44 | 0.99 |
| 2017-03-13 | 0.05 | 0.28 | 0.44 | 1 |
| 2017-03-14 | 0.05 | 0.28 | 0.44 | 1 |
| 2017-03-15 | 0.05 | 0.28 | 0.44 | 0.99 |
| 2017-03-16 | 0.05 | 0.28 | 0.44 | 0.99 |
| 2017-03-17 | 0.05 | 0.28 | 0.44 | 0.99 |
| 2017-03-20 | 0.05 | 0.28 | 0.44 | 0.96 |
| 2017-03-21 | 0.05 | 0.28 | 0.44 | 0.97 |
| 2017-03-22 | 0.05 | 0.28 | 0.44 | 0.9 |
| 2017-03-23 | 0.05 | 0.28 | 0.44 | 0.87 |
| 2017-03-24 | 0.05 | 0.28 | 0.44 | 0.92 |
| 2017-03-27 | 0.05 | 0.28 | 0.44 | 0.86 |
| 2017-03-28 | 0.05 | 0.28 | 0.44 | 0.84 |
| 2017-03-29 | 0.05 | 0.28 | 0.44 | 0.84 |
| 2017-03-30 | 0.05 | 0.28 | 0.44 | 0.8 |
| 2017-03-31 | 0.05 | 0.28 | 0.44 | 0.66 |
| 2017-04-03 | 0.05 | 0.28 | 0.44 | 0.71 |
| 2017-04-04 | 0.05 | 0.28 | 0.44 | 0.68 |
| 2017-04-05 | 0.05 | 0.28 | 0.44 | 0.73 |
| 2017-04-06 | 0.05 | 0.28 | 0.44 | 0.76 |
| 2017-04-07 | 0.05 | 0.29 | 0.44 | 0.89 |
| 2017-04-10 | 0.05 | 0.29 | 0.45 | 0.89 |
| 2017-04-11 | 0.05 | 0.29 | 0.45 | 0.91 |
| 2017-04-12 | 0.05 | 0.29 | 0.45 | 0.89 |
| 2017-04-13 | 0.05 | 0.29 | 0.45 | 0.88 |
| 2017-04-18 | 0.05 | 0.29 | 0.45 | 0.85 |
| 2017-04-19 | 0.05 | 0.29 | 0.45 | 0.82 |
| 2017-04-20 | 0.05 | 0.29 | 0.45 | 0.87 |
| 2017-04-21 | 0.05 | 0.29 | 0.45 | 0.88 |
| 2017-04-24 | 0.05 | 0.29 | 0.45 | 0.95 |
| 2017-04-25 | 0.05 | 0.29 | 0.45 | 0.93 |
| 2017-04-26 | 0.05 | 0.29 | 0.45 | 0.94 |
| 2017-04-27 | 0.05 | 0.29 | 0.45 | 0.99 |
| 2017-04-28 | 0.05 | 0.29 | 0.45 | 1.02 |
| 2017-05-02 | 0.05 | 0.29 | 0.45 | 1.02 |
| 2017-05-03 | 0.05 | 0.29 | 0.45 | 0.98 |
| 2017-05-04 | 0.05 | 0.29 | 0.45 | 1.01 |
| 2017-05-05 | 0.05 | 0.29 | 0.45 | 0.95 |
| 2017-05-09 | 0.05 | 0.29 | 0.46 | 0.97 |
| 2017-05-10 | 0.05 | 0.29 | 0.46 | 0.92 |
| 2017-05-11 | 0.05 | 0.3 | 0.46 | 0.94 |
| 2017-05-12 | 0.05 | 0.3 | 0.46 | 0.96 |
| 2017-05-15 | 0.05 | 0.3 | 0.46 | 0.96 |
| 2017-05-16 | 0.05 | 0.3 | 0.46 | 1 |
| 2017-05-17 | 0.05 | 0.3 | 0.46 | 0.97 |
| 2017-05-18 | 0.05 | 0.3 | 0.46 | 0.95 |
| 2017-05-19 | 0.05 | 0.3 | 0.46 | 0.96 |
| 2017-05-22 | 0.05 | 0.3 | 0.46 | 0.97 |
| 2017-05-23 | 0.05 | 0.3 | 0.46 | 0.94 |
| 2017-05-24 | 0.05 | 0.3 | 0.47 | 0.92 |
| 2017-05-25 | 0.05 | 0.3 | 0.47 | 0.89 |
| 2017-05-26 | 0.05 | 0.3 | 0.47 | 0.87 |
| 2017-05-29 | 0.05 | 0.3 | 0.47 | 0.87 |
| 2017-05-30 | 0.05 | 0.3 | 0.46 | 0.84 |
| 2017-05-31 | 0.05 | 0.3 | 0.46 | 0.82 |
| 2017-06-01 | 0.05 | 0.3 | 0.46 | 0.81 |
| 2017-06-02 | 0.05 | 0.29 | 0.46 | 0.81 |
| 2017-06-05 | 0.05 | 0.29 | 0.46 | 0.82 |
| 2017-06-06 | 0.05 | 0.29 | 0.46 | 0.82 |
| 2017-06-07 | 0.05 | 0.29 | 0.46 | 0.81 |
| 2017-06-08 | 0.05 | 0.29 | 0.46 | 0.85 |
| 2017-06-09 | 0.05 | 0.3 | 0.46 | 0.89 |
| 2017-06-12 | 0.05 | 0.3 | 0.46 | 0.86 |
| 2017-06-13 | 0.05 | 0.3 | 0.46 | 0.87 |
| 2017-06-14 | 0.05 | 0.3 | 0.46 | 0.87 |
| 2017-06-15 | 0.05 | 0.3 | 0.46 | 0.83 |
| 2017-06-16 | 0.05 | 0.3 | 0.46 | 0.88 |
| 2017-06-19 | 0.05 | 0.3 | 0.46 | 0.86 |
| 2017-06-20 | 0.05 | 0.3 | 0.46 | 0.86 |
| 2017-06-21 | 0.05 | 0.3 | 0.46 | 0.86 |
| 2017-06-22 | 0.05 | 0.3 | 0.46 | 0.86 |
| 2017-06-23 | 0.05 | 0.3 | 0.46 | 0.84 |
| 2017-06-26 | 0.05 | 0.3 | 0.46 | 0.83 |
| 2017-06-27 | 0.05 | 0.3 | 0.46 | 0.82 |
| 2017-06-28 | 0.05 | 0.3 | 0.46 | 0.89 |
| 2017-06-29 | 0.05 | 0.29 | 0.46 | 0.94 |
| 2017-06-30 | 0.05 | 0.3 | 0.46 | 0.97 |
| 2017-07-03 | 0.05 | 0.3 | 0.46 | 0.99 |
| 2017-07-04 | 0.05 | 0.3 | 0.46 | 0.98 |
| 2017-07-07 | 0.05 | 0.3 | 0.47 | 1.06 |
| 2017-07-10 | 0.05 | 0.3 | 0.47 | 1.08 |
| 2017-07-11 | 0.05 | 0.3 | 0.47 | 1.05 |
| 2017-07-12 | 0.05 | 0.3 | 0.47 | 1.05 |
| 2017-07-13 | 0.05 | 0.3 | 0.47 | 1.03 |
| 2017-07-14 | 0.05 | 0.3 | 0.47 | 1.03 |
| 2017-07-17 | 0.05 | 0.3 | 0.47 | 1.03 |
| 2017-07-18 | 0.05 | 0.3 | 0.47 | 1.03 |
| 2017-07-19 | 0.05 | 0.3 | 0.47 | 1.09 |
| 2017-07-20 | 0.05 | 0.3 | 0.48 | 1.1 |
| 2017-07-21 | 0.05 | 0.3 | 0.48 | 1.08 |
| 2017-07-24 | 0.05 | 0.3 | 0.48 | 1.08 |
| 2017-07-25 | 0.05 | 0.3 | 0.48 | 1.13 |
| 2017-07-26 | 0.05 | 0.3 | 0.48 | 1.14 |
| 2017-07-27 | 0.05 | 0.3 | 0.48 | 1.14 |
| 2017-07-28 | 0.05 | 0.31 | 0.48 | 1.15 |
| 2017-07-31 | 0.05 | 0.31 | 0.49 | 1.17 |
| 2017-08-01 | 0.05 | 0.31 | 0.49 | 1.18 |
| 2017-08-02 | 0.05 | 0.31 | 0.49 | 1.14 |
| 2017-08-03 | 0.05 | 0.31 | 0.49 | 1.16 |
| 2017-08-04 | 0.25 | 0.43 | 0.56 | 1.08 |
| 2017-08-07 | 0.25 | 0.44 | 0.59 | 1.07 |
| 2017-08-08 | 0.25 | 0.44 | 0.6 | 1.06 |
| 2017-08-09 | 0.25 | 0.45 | 0.6 | 1.09 |
| 2017-08-10 | 0.25 | 0.45 | 0.61 | 1.07 |
| 2017-08-11 | 0.25 | 0.45 | 0.61 | 1.09 |
| 2017-08-14 | 0.25 | 0.45 | 0.61 | 1.11 |
| 2017-08-15 | 0.25 | 0.45 | 0.61 | 1.11 |
| 2017-08-16 | 0.25 | 0.45 | 0.62 | 1.16 |
| 2017-08-17 | 0.25 | 0.46 | 0.62 | 1.14 |
| 2017-08-18 | 0.25 | 0.46 | 0.62 | 1.14 |
| 2017-08-21 | 0.25 | 0.46 | 0.62 | 1.14 |
| 2017-08-22 | 0.25 | 0.46 | 0.63 | 1.12 |
| 2017-08-23 | 0.25 | 0.46 | 0.63 | 1.13 |
| 2017-08-24 | 0.25 | 0.46 | 0.63 | 1.13 |
| 2017-08-25 | 0.25 | 0.46 | 0.63 | 1.14 |
| 2017-08-28 | 0.25 | 0.46 | 0.63 | 1.14 |
| 2017-08-29 | 0.25 | 0.46 | 0.63 | 1.14 |
| 2017-08-30 | 0.25 | 0.46 | 0.63 | 1.12 |
| 2017-08-31 | 0.25 | 0.46 | 0.63 | 1.14 |
| 2017-09-01 | 0.25 | 0.46 | 0.63 | 1.15 |
| 2017-09-04 | 0.25 | 0.46 | 0.63 | 1.19 |
| 2017-09-05 | 0.25 | 0.46 | 0.63 | 1.19 |
| 2017-09-06 | 0.25 | 0.46 | 0.63 | 1.17 |
| 2017-09-07 | 0.25 | 0.46 | 0.63 | 1.19 |
| 2017-09-08 | 0.25 | 0.46 | 0.63 | 1.2 |
| 2017-09-11 | 0.25 | 0.46 | 0.63 | 1.23 |
| 2017-09-12 | 0.25 | 0.46 | 0.64 | 1.24 |
| 2017-09-13 | 0.25 | 0.46 | 0.64 | 1.28 |
| 2017-09-14 | 0.25 | 0.46 | 0.64 | 1.28 |
| 2017-09-15 | 0.25 | 0.46 | 0.64 | 1.3 |
| 2017-09-18 | 0.25 | 0.46 | 0.64 | 1.3 |
| 2017-09-19 | 0.25 | 0.46 | 0.64 | 1.33 |
| 2017-09-20 | 0.25 | 0.46 | 0.64 | 1.32 |
| 2017-09-21 | 0.25 | 0.46 | 0.64 | 1.35 |
| 2017-09-22 | 0.25 | 0.46 | 0.64 | 1.32 |
| 2017-09-25 | 0.25 | 0.46 | 0.64 | 1.31 |
| 2017-09-26 | 0.25 | 0.46 | 0.64 | 1.3 |
| 2017-09-27 | 0.25 | 0.47 | 0.64 | 1.33 |
| 2017-09-29 | 0.25 | 0.47 | 0.65 | 1.37 |
| 2017-10-02 | 0.25 | 0.47 | 0.65 | 1.39 |
| 2017-10-03 | 0.25 | 0.47 | 0.65 | 1.39 |
| 2017-10-04 | 0.25 | 0.47 | 0.65 | 1.36 |
| 2017-10-05 | 0.25 | 0.48 | 0.66 | 1.32 |
| 2017-10-06 | 0.25 | 0.49 | 0.66 | 1.38 |
| 2017-10-09 | 0.25 | 0.49 | 0.67 | 1.36 |
| 2017-10-10 | 0.25 | 0.49 | 0.67 | 1.35 |
| 2017-10-11 | 0.25 | 0.49 | 0.66 | 1.37 |
| 2017-10-12 | 0.25 | 0.49 | 0.66 | 1.32 |
| 2017-10-13 | 0.25 | 0.5 | 0.67 | 1.35 |
| 2017-10-16 | 0.25 | 0.51 | 0.68 | 1.37 |
| 2017-10-17 | 0.25 | 0.51 | 0.69 | 1.4 |
| 2017-10-18 | 0.25 | 0.52 | 0.7 | 1.49 |
| 2017-10-19 | 0.25 | 0.52 | 0.71 | 1.45 |
| 2017-10-20 | 0.25 | 0.52 | 0.71 | 1.46 |
| 2017-10-23 | 0.25 | 0.53 | 0.72 | 1.47 |
| 2017-10-24 | 0.25 | 0.54 | 0.72 | 1.47 |
| 2017-10-25 | 0.25 | 0.54 | 0.73 | 1.53 |
| 2017-10-26 | 0.25 | 0.55 | 0.74 | 1.55 |
| 2017-10-27 | 0.25 | 0.56 | 0.74 | 1.56 |
| 2017-10-30 | 0.25 | 0.57 | 0.75 | 1.59 |
| 2017-10-31 | 0.25 | 0.58 | 0.77 | 1.52 |
| 2017-11-01 | 0.25 | 0.59 | 0.77 | 1.53 |
| 2017-11-02 | 0.25 | 0.61 | 0.79 | 1.59 |
| 2017-11-03 | 0.5 | 0.69 | 0.87 | 1.5 |
| 2017-11-06 | 0.5 | 0.7 | 0.89 | 1.48 |
| 2017-11-07 | 0.5 | 0.7 | 0.89 | 1.53 |
| 2017-11-08 | 0.5 | 0.71 | 0.89 | 1.52 |
| 2017-11-09 | 0.5 | 0.72 | 0.9 | 1.57 |
| 2017-11-10 | 0.5 | 0.72 | 0.91 | 1.61 |
| 2017-11-13 | 0.5 | 0.72 | 0.91 | 1.56 |
| 2017-11-14 | 0.5 | 0.72 | 0.92 | 1.59 |
| 2017-11-15 | 0.5 | 0.72 | 0.92 | 1.55 |
| 2017-11-16 | 0.5 | 0.72 | 0.93 | 1.63 |
| 2017-11-20 | 0.5 | 0.73 | 0.93 | 1.6 |
| 2017-11-21 | 0.5 | 0.73 | 0.94 | 1.65 |
| 2017-11-22 | 0.5 | 0.73 | 0.94 | 1.67 |
| 2017-11-23 | 0.5 | 0.73 | 0.94 | 1.68 |
| 2017-11-24 | 0.5 | 0.74 | 0.94 | 1.68 |
| 2017-11-27 | 0.5 | 0.74 | 0.94 | 1.68 |
| 2017-11-28 | 0.5 | 0.74 | 0.94 | 1.68 |
| 2017-11-29 | 0.5 | 0.74 | 0.95 | 1.65 |
| 2017-11-30 | 0.5 | 0.74 | 0.95 | 1.66 |
| 2017-12-01 | 0.5 | 0.74 | 0.94 | 1.6 |
| 2017-12-04 | 0.5 | 0.74 | 0.95 | 1.6 |
| 2017-12-05 | 0.5 | 0.74 | 0.95 | 1.59 |
| 2017-12-06 | 0.5 | 0.74 | 0.95 | 1.58 |
| 2017-12-07 | 0.5 | 0.74 | 0.95 | 1.57 |
| 2017-12-08 | 0.5 | 0.75 | 0.95 | 1.57 |
| 2017-12-11 | 0.5 | 0.75 | 0.95 | 1.59 |
| 2017-12-12 | 0.5 | 0.75 | 0.95 | 1.59 |
| 2017-12-13 | 0.5 | 0.75 | 0.96 | 1.64 |
| 2017-12-14 | 0.5 | 0.76 | 0.97 | 1.66 |
| 2017-12-15 | 0.5 | 0.76 | 0.97 | 1.66 |
| 2017-12-18 | 0.5 | 0.76 | 0.97 | 1.66 |
| 2017-12-19 | 0.5 | 0.76 | 0.97 | 1.65 |
| 2017-12-20 | 0.5 | 0.76 | 0.97 | 1.66 |
| 2017-12-21 | 0.5 | 0.76 | 0.97 | 1.66 |
| 2017-12-22 | 0.5 | 0.76 | 0.97 | 1.66 |
| 2017-12-27 | 0.5 | 0.76 | 0.97 | 1.63 |
| 2017-12-28 | 0.5 | 0.76 | 0.97 | 1.64 |
| 2017-12-29 | 0.5 | 0.76 | 0.97 | 1.64 |
| 2018-01-02 | 0.5 | 0.76 | 0.97 | 1.7 |
| 2018-01-03 | 0.5 | 0.76 | 0.97 | 1.69 |
| 2018-01-04 | 0.5 | 0.76 | 0.97 | 1.68 |
| 2018-01-05 | 0.5 | 0.76 | 0.97 | 1.65 |
| 2018-01-08 | 0.5 | 0.76 | 0.97 | 1.63 |
| 2018-01-09 | 0.5 | 0.76 | 0.97 | 1.63 |
| 2018-01-10 | 0.5 | 0.76 | 0.97 | 1.6 |
| 2018-01-11 | 0.5 | 0.78 | 0.99 | 1.59 |
| 2018-01-12 | 0.5 | 0.76 | 0.97 | 1.63 |
| 2018-01-15 | 0.5 | 0.76 | 0.97 | 1.65 |
| 2018-01-16 | 0.5 | 0.76 | 0.97 | 1.66 |
| 2018-01-17 | 0.5 | 0.77 | 0.98 | 1.69 |
| 2018-01-18 | 0.5 | 0.77 | 0.98 | 1.75 |
| 2018-01-19 | 0.5 | 0.77 | 0.98 | 1.77 |
| 2018-01-22 | 0.5 | 0.77 | 0.98 | 1.77 |
| 2018-01-23 | 0.5 | 0.77 | 0.98 | 1.75 |
| 2018-01-24 | 0.5 | 0.77 | 0.98 | 1.75 |
| 2018-01-25 | 0.5 | 0.78 | 0.99 | 1.75 |
| 2018-01-26 | 0.5 | 0.78 | 0.99 | 1.79 |
| 2018-01-29 | 0.5 | 0.79 | 1 | 1.86 |
| 2018-01-30 | 0.5 | 0.81 | 1.01 | 1.84 |
| 2018-01-31 | 0.5 | 0.81 | 1.02 | 1.82 |
| 2018-02-01 | 0.5 | 0.83 | 1.03 | 1.86 |
| 2018-02-02 | 0.75 | 0.91 | 1.11 | 1.9 |
| 2018-02-05 | 0.75 | 0.91 | 1.11 | 1.86 |
| 2018-02-06 | 0.75 | 0.91 | 1.11 | 1.8 |
| 2018-02-07 | 0.75 | 0.91 | 1.11 | 1.79 |
| 2018-02-08 | 0.75 | 0.91 | 1.11 | 1.81 |
| 2018-02-09 | 0.75 | 0.9 | 1.11 | 1.75 |
| 2018-02-12 | 0.75 | 0.9 | 1.11 | 1.77 |
| 2018-02-13 | 0.75 | 0.9 | 1.11 | 1.75 |
| 2018-02-14 | 0.75 | 0.9 | 1.11 | 1.72 |
| 2018-02-15 | 0.75 | 0.9 | 1.11 | 1.76 |
| 2018-02-16 | 0.75 | 0.9 | 1.11 | 1.73 |
| 2018-02-19 | 0.75 | 0.91 | 1.11 | 1.72 |
| 2018-02-20 | 0.75 | 0.91 | 1.11 | 1.76 |
| 2018-02-21 | 0.75 | 0.91 | 1.11 | 1.73 |
| 2018-02-22 | 0.75 | 0.91 | 1.12 | 1.71 |
| 2018-02-23 | 0.75 | 0.91 | 1.12 | 1.71 |
| 2018-02-26 | 0.75 | 0.91 | 1.12 | 1.69 |
| 2018-02-27 | 0.75 | 0.91 | 1.12 | 1.71 |
| 2018-02-28 | 0.75 | 0.91 | 1.12 | 1.73 |
| 2018-03-01 | 0.75 | 0.91 | 1.12 | 1.7 |
| 2018-03-02 | 0.75 | 0.91 | 1.12 | 1.68 |
| 2018-03-05 | 0.75 | 0.91 | 1.12 | 1.67 |
| 2018-03-06 | 0.75 | 0.91 | 1.12 | 1.69 |
| 2018-03-07 | 0.75 | 0.91 | 1.12 | 1.69 |
| 2018-03-08 | 0.75 | 0.91 | 1.12 | 1.71 |
| 2018-03-09 | 0.75 | 0.9 | 1.12 | 1.68 |
| 2018-03-12 | 0.75 | 0.9 | 1.12 | 1.67 |
| 2018-03-13 | 0.75 | 0.9 | 1.12 | 1.67 |
| 2018-03-14 | 0.75 | 0.9 | 1.12 | 1.67 |
| 2018-03-15 | 0.75 | 0.9 | 1.12 | 1.7 |
| 2018-03-16 | 0.75 | 0.9 | 1.12 | 1.7 |
| 2018-03-19 | 0.75 | 0.9 | 1.12 | 1.71 |
| 2018-03-20 | 0.75 | 0.9 | 1.12 | 1.72 |
| 2018-03-21 | 0.75 | 0.9 | 1.12 | 1.76 |
| 2018-03-22 | 0.75 | 0.9 | 1.12 | 1.75 |
| 2018-03-23 | 0.75 | 0.9 | 1.12 | 1.73 |
| 2018-03-26 | 0.75 | 0.9 | 1.12 | 1.71 |
| 2018-03-27 | 0.75 | 0.9 | 1.12 | 1.69 |
| 2018-03-28 | 0.75 | 0.9 | 1.12 | 1.64 |
| 2018-03-29 | 0.75 | 0.9 | 1.12 | 1.65 |
| 2018-04-03 | 0.75 | 0.9 | 1.12 | 1.66 |
| 2018-04-04 | 0.75 | 0.9 | 1.12 | 1.66 |
| 2018-04-05 | 0.75 | 0.9 | 1.12 | 1.68 |
| 2018-04-06 | 0.75 | 0.9 | 1.12 | 1.66 |
| 2018-04-09 | 0.75 | 0.9 | 1.12 | 1.65 |
| 2018-04-10 | 0.75 | 0.9 | 1.12 | 1.65 |
| 2018-04-11 | 0.75 | 0.9 | 1.12 | 1.63 |
| 2018-04-12 | 0.75 | 0.9 | 1.12 | 1.62 |
| 2018-04-13 | 0.75 | 0.9 | 1.12 | 1.64 |
| 2018-04-16 | 0.75 | 0.9 | 1.12 | 1.64 |
| 2018-04-17 | 0.75 | 0.9 | 1.13 | 1.63 |
| 2018-04-18 | 0.75 | 0.9 | 1.12 | 1.61 |
| 2018-04-19 | 0.75 | 0.9 | 1.12 | 1.62 |
| 2018-04-20 | 0.75 | 0.9 | 1.12 | 1.63 |
| 2018-04-23 | 0.75 | 0.9 | 1.12 | 1.66 |
| 2018-04-24 | 0.75 | 0.9 | 1.12 | 1.65 |
| 2018-04-25 | 0.75 | 0.9 | 1.12 | 1.66 |
| 2018-04-26 | 0.75 | 0.9 | 1.12 | 1.66 |
| 2018-04-27 | 0.75 | 0.9 | 1.12 | 1.62 |
| 2018-04-30 | 0.75 | 0.9 | 1.12 | 1.62 |
| 2018-05-02 | 0.75 | 0.9 | 1.12 | 1.64 |
| 2018-05-03 | 0.75 | 0.9 | 1.12 | 1.67 |
| 2018-05-04 | 0.75 | 0.9 | 1.12 | 1.68 |
| 2018-05-07 | 0.75 | 0.9 | 1.12 | 1.68 |
| 2018-05-09 | 0.75 | 0.9 | 1.12 | 1.74 |
| 2018-05-10 | 0.75 | 0.9 | 1.12 | 1.76 |
| 2018-05-11 | 0.75 | 0.9 | 1.12 | 1.76 |
| 2018-05-14 | 0.75 | 0.9 | 1.12 | 1.8 |
| 2018-05-15 | 0.75 | 0.9 | 1.12 | 1.82 |
| 2018-05-16 | 0.75 | 0.9 | 1.12 | 1.84 |
| 2018-05-17 | 0.75 | 0.9 | 1.12 | 1.86 |
| 2018-05-18 | 0.75 | 0.9 | 1.12 | 1.84 |
| 2018-05-21 | 0.75 | 0.9 | 1.12 | 1.87 |
| 2018-05-22 | 0.75 | 0.9 | 1.12 | 1.89 |
| 2018-05-23 | 0.75 | 0.9 | 1.12 | 1.85 |
| 2018-05-24 | 0.75 | 0.9 | 1.12 | 1.82 |
| 2018-05-25 | 0.75 | 0.9 | 1.12 | 1.79 |
| 2018-05-28 | 0.75 | 0.9 | 1.12 | 1.76 |
| 2018-05-29 | 0.75 | 0.9 | 1.12 | 1.7 |
| 2018-05-30 | 0.75 | 0.9 | 1.12 | 1.68 |
| 2018-05-31 | 0.75 | 0.9 | 1.12 | 1.73 |
| 2018-06-01 | 0.75 | 0.9 | 1.12 | 1.72 |
| 2018-06-04 | 0.75 | 0.9 | 1.12 | 1.73 |
| 2018-06-05 | 0.75 | 0.9 | 1.12 | 1.76 |
| 2018-06-06 | 0.75 | 0.9 | 1.12 | 1.83 |
| 2018-06-07 | 0.75 | 0.9 | 1.12 | 1.86 |
| 2018-06-08 | 0.75 | 0.9 | 1.12 | 1.84 |
| 2018-06-11 | 0.75 | 0.92 | 1.13 | 1.93 |
| 2018-06-12 | 0.75 | 0.92 | 1.14 | 1.93 |
| 2018-06-13 | 0.75 | 0.92 | 1.14 | 1.91 |
| 2018-06-14 | 0.75 | 0.93 | 1.14 | 1.94 |
| 2018-06-15 | 0.75 | 0.92 | 1.14 | 1.94 |
| 2018-06-18 | 0.75 | 0.93 | 1.15 | 1.91 |
| 2018-06-19 | 0.75 | 0.93 | 1.15 | 1.87 |
| 2018-06-20 | 0.75 | 0.93 | 1.15 | 1.85 |
| 2018-06-21 | 0.75 | 0.93 | 1.15 | 1.85 |
| 2018-06-22 | 0.75 | 0.93 | 1.16 | 1.85 |
| 2018-06-25 | 0.75 | 0.93 | 1.16 | 1.8 |
| 2018-06-26 | 0.75 | 0.93 | 1.16 | 1.84 |
| 2018-06-27 | 0.75 | 0.93 | 1.16 | 1.82 |
| 2018-06-28 | 1 | 1.16 | 1.35 | 1.94 |
| 2018-06-29 | 1 | 1.16 | 1.35 | 1.94 |
| 2018-07-02 | 1 | 1.16 | 1.35 | 1.92 |
| 2018-07-03 | 1 | 1.16 | 1.35 | 1.97 |
| 2018-07-04 | 1 | 1.17 | 1.36 | 2 |
| 2018-07-09 | 1 | 1.17 | 1.37 | 1.92 |
| 2018-07-10 | 1 | 1.17 | 1.37 | 1.94 |
| 2018-07-11 | 1 | 1.18 | 1.38 | 2.02 |
| 2018-07-12 | 1 | 1.18 | 1.38 | 2.02 |
| 2018-07-13 | 1 | 1.18 | 1.39 | 2.05 |
| 2018-07-16 | 1 | 1.18 | 1.39 | 2.03 |
| 2018-07-17 | 1 | 1.19 | 1.4 | 2.03 |
| 2018-07-18 | 1 | 1.18 | 1.39 | 2.01 |
| 2018-07-19 | 1 | 1.19 | 1.39 | 2.02 |
| 2018-07-20 | 1 | 1.18 | 1.39 | 2.01 |
| 2018-07-23 | 1 | 1.19 | 1.39 | 2.03 |
| 2018-07-24 | 1 | 1.19 | 1.4 | 2.08 |
| 2018-07-25 | 1 | 1.2 | 1.41 | 2.09 |
| 2018-07-26 | 1 | 1.2 | 1.41 | 2.12 |
| 2018-07-27 | 1 | 1.2 | 1.41 | 2.15 |
| 2018-07-30 | 1 | 1.21 | 1.43 | 2.15 |
| 2018-07-31 | 1 | 1.22 | 1.43 | 2.17 |
| 2018-08-01 | 1 | 1.23 | 1.45 | 2.18 |
| 2018-08-02 | 1 | 1.24 | 1.45 | 2.17 |
| 2018-08-03 | 1.25 | 1.42 | 1.61 | 2.21 |
| 2018-08-06 | 1.25 | 1.44 | 1.64 | 2.19 |
| 2018-08-07 | 1.25 | 1.45 | 1.65 | 2.19 |
| 2018-08-08 | 1.25 | 1.45 | 1.66 | 2.19 |
| 2018-08-09 | 1.25 | 1.46 | 1.67 | 2.17 |
| 2018-08-10 | 1.25 | 1.46 | 1.67 | 2.18 |
| 2018-08-13 | 1.25 | 1.46 | 1.68 | 2.15 |
| 2018-08-14 | 1.25 | 1.46 | 1.68 | 2.13 |
| 2018-08-15 | 1.25 | 1.46 | 1.68 | 2.16 |
| 2018-08-16 | 1.25 | 1.46 | 1.68 | 2.17 |
| 2018-08-17 | 1.25 | 1.47 | 1.68 | 2.18 |
| 2018-08-20 | 1.25 | 1.47 | 1.69 | 2.2 |
| 2018-08-21 | 1.25 | 1.48 | 1.7 | 2.22 |
| 2018-08-22 | 1.25 | 1.48 | 1.71 | 2.22 |
| 2018-08-23 | 1.25 | 1.48 | 1.71 | 2.23 |
| 2018-08-24 | 1.25 | 1.48 | 1.71 | 2.24 |
| 2018-08-27 | 1.25 | 1.49 | 1.71 | 2.24 |
| 2018-08-28 | 1.25 | 1.49 | 1.72 | 2.24 |
| 2018-08-29 | 1.25 | 1.49 | 1.72 | 2.24 |
| 2018-08-30 | 1.25 | 1.49 | 1.73 | 2.24 |
| 2018-08-31 | 1.25 | 1.5 | 1.73 | 2.23 |
| 2018-09-03 | 1.25 | 1.5 | 1.73 | 2.23 |
| 2018-09-04 | 1.25 | 1.5 | 1.74 | 2.25 |
| 2018-09-05 | 1.25 | 1.51 | 1.74 | 2.29 |
| 2018-09-06 | 1.25 | 1.51 | 1.75 | 2.3 |
| 2018-09-07 | 1.25 | 1.51 | 1.74 | 2.3 |
| 2018-09-10 | 1.25 | 1.51 | 1.75 | 2.3 |
| 2018-09-11 | 1.25 | 1.52 | 1.77 | 2.37 |
| 2018-09-12 | 1.25 | 1.53 | 1.78 | 2.4 |
| 2018-09-13 | 1.25 | 1.54 | 1.78 | 2.39 |
| 2018-09-14 | 1.25 | 1.54 | 1.79 | 2.39 |
| 2018-09-17 | 1.25 | 1.54 | 1.79 | 2.39 |
| 2018-09-18 | 1.25 | 1.55 | 1.8 | 2.39 |
| 2018-09-19 | 1.25 | 1.56 | 1.81 | 2.42 |
| 2018-09-20 | 1.25 | 1.56 | 1.81 | 2.44 |
| 2018-09-21 | 1.25 | 1.56 | 1.82 | 2.43 |
| 2018-09-24 | 1.25 | 1.56 | 1.82 | 2.43 |
| 2018-09-25 | 1.25 | 1.57 | 1.82 | 2.46 |
| 2018-09-26 | 1.25 | 1.58 | 1.83 | 2.46 |
| 2018-09-27 | 1.5 | 1.7 | 1.89 | 2.43 |
| 2018-10-01 | 1.5 | 1.72 | 1.9 | 2.43 |
| 2018-10-02 | 1.5 | 1.73 | 1.91 | 2.43 |
| 2018-10-03 | 1.5 | 1.73 | 1.92 | 2.5 |
| 2018-10-04 | 1.5 | 1.74 | 1.93 | 2.57 |
| 2018-10-05 | 1.5 | 1.74 | 1.93 | 2.56 |
| 2018-10-08 | 1.5 | 1.74 | 1.93 | 2.56 |
| 2018-10-09 | 1.5 | 1.75 | 1.93 | 2.6 |
| 2018-10-10 | 1.5 | 1.75 | 1.94 | 2.61 |
| 2018-10-11 | 1.5 | 1.75 | 1.95 | 2.61 |
| 2018-10-12 | 1.5 | 1.75 | 1.96 | 2.63 |
| 2018-10-15 | 1.5 | 1.76 | 1.96 | 2.64 |
| 2018-10-16 | 1.5 | 1.76 | 1.97 | 2.66 |
| 2018-10-17 | 1.5 | 1.76 | 1.97 | 2.65 |
| 2018-10-18 | 1.5 | 1.76 | 1.97 | 2.66 |
| 2018-10-19 | 1.5 | 1.77 | 1.97 | 2.64 |
| 2018-10-22 | 1.5 | 1.77 | 1.97 | 2.67 |
| 2018-10-23 | 1.5 | 1.77 | 1.98 | 2.64 |
| 2018-10-24 | 1.5 | 1.78 | 1.98 | 2.57 |
| 2018-10-25 | 1.5 | 1.78 | 1.97 | 2.56 |
| 2018-10-26 | 1.5 | 1.79 | 1.98 | 2.56 |
| 2018-10-29 | 1.5 | 1.8 | 1.99 | 2.55 |
| 2018-10-30 | 1.5 | 1.8 | 1.99 | 2.56 |
| 2018-10-31 | 1.5 | 1.81 | 2 | 2.58 |
| 2018-11-01 | 1.5 | 1.82 | 2.01 | 2.6 |
| 2018-11-02 | 1.75 | 1.96 | 2.14 | 2.58 |
| 2018-11-05 | 1.75 | 1.97 | 2.14 | 2.57 |
| 2018-11-06 | 1.75 | 1.97 | 2.15 | 2.52 |
| 2018-11-07 | 1.75 | 1.97 | 2.16 | 2.56 |
| 2018-11-08 | 1.75 | 1.98 | 2.17 | 2.6 |
| 2018-11-09 | 1.75 | 1.99 | 2.18 | 2.6 |
| 2018-11-12 | 1.75 | 1.99 | 2.18 | 2.6 |
| 2018-11-13 | 1.75 | 1.99 | 2.18 | 2.62 |
| 2018-11-14 | 1.75 | 1.99 | 2.19 | 2.58 |
| 2018-11-15 | 1.75 | 2 | 2.2 | 2.56 |
| 2018-11-16 | 1.75 | 2 | 2.2 | 2.56 |
| 2018-11-19 | 1.75 | 2 | 2.2 | 2.55 |
| 2018-11-20 | 1.75 | 2.01 | 2.21 | 2.53 |
| 2018-11-21 | 1.75 | 2.01 | 2.21 | 2.51 |
| 2018-11-22 | 1.75 | 2.01 | 2.21 | 2.48 |
| 2018-11-23 | 1.75 | 2.02 | 2.22 | 2.49 |
| 2018-11-26 | 1.75 | 2.02 | 2.22 | 2.46 |
| 2018-11-27 | 1.75 | 2.02 | 2.22 | 2.4 |
| 2018-11-28 | 1.75 | 2.02 | 2.22 | 2.4 |
| 2018-11-29 | 1.75 | 2.02 | 2.22 | 2.42 |
| 2018-11-30 | 1.75 | 2.02 | 2.22 | 2.41 |
| 2018-12-03 | 1.75 | 2.01 | 2.21 | 2.47 |
| 2018-12-04 | 1.75 | 2.01 | 2.21 | 2.4 |
| 2018-12-05 | 1.75 | 2.01 | 2.21 | 2.37 |
| 2018-12-06 | 1.75 | 2.01 | 2.21 | 2.37 |
| 2018-12-07 | 1.75 | 2.01 | 2.21 | 2.36 |
| 2018-12-10 | 1.75 | 2.01 | 2.21 | 2.34 |
| 2018-12-11 | 1.75 | 2.01 | 2.21 | 2.32 |
| 2018-12-12 | 1.75 | 2.01 | 2.21 | 2.34 |
| 2018-12-13 | 1.75 | 2.02 | 2.21 | 2.36 |
| 2018-12-14 | 1.75 | 2.02 | 2.21 | 2.35 |
| 2018-12-17 | 1.75 | 2.02 | 2.21 | 2.33 |
| 2018-12-18 | 1.75 | 2.02 | 2.21 | 2.3 |
| 2018-12-19 | 1.75 | 2.02 | 2.21 | 2.29 |
| 2018-12-20 | 1.75 | 2.02 | 2.21 | 2.11 |
| 2018-12-21 | 1.75 | 2.02 | 2.21 | 2.06 |
| 2018-12-27 | 1.75 | 2.01 | 2.2 | 1.99 |
| 2018-12-28 | 1.75 | 2.02 | 2.21 | 1.86 |
| 2018-12-31 | 1.75 | 2.01 | 2.21 | 1.85 |
| 2019-01-02 | 1.75 | 2.01 | 2.2 | 1.75 |
| 2019-01-03 | 1.75 | 2.01 | 2.2 | 1.74 |
| 2019-01-04 | 1.75 | 2.01 | 2.21 | 1.83 |
| 2019-01-07 | 1.75 | 2.01 | 2.21 | 1.88 |
| 2019-01-08 | 1.75 | 2.01 | 2.21 | 1.9 |
| 2019-01-09 | 1.75 | 2.01 | 2.21 | 2 |
| 2019-01-10 | 1.75 | 2.01 | 2.21 | 1.97 |
| 2019-01-11 | 1.75 | 2.01 | 2.21 | 1.94 |
| 2019-01-14 | 1.75 | 2.01 | 2.21 | 1.88 |
| 2019-01-15 | 1.75 | 2.01 | 2.21 | 1.77 |
| 2019-01-16 | 1.75 | 2.01 | 2.21 | 1.88 |
| 2019-01-17 | 1.75 | 2.01 | 2.21 | 1.94 |
| 2019-01-18 | 1.75 | 2.01 | 2.22 | 2.01 |
| 2019-01-21 | 1.75 | 2.01 | 2.22 | 1.99 |
| 2019-01-22 | 1.75 | 2.01 | 2.22 | 1.99 |
| 2019-01-23 | 1.75 | 2.01 | 2.22 | 1.96 |
| 2019-01-24 | 1.75 | 2 | 2.22 | 1.97 |
| 2019-01-25 | 1.75 | 2 | 2.22 | 1.93 |
| 2019-01-28 | 1.75 | 2 | 2.22 | 1.93 |
| 2019-01-29 | 1.75 | 1.99 | 2.22 | 1.96 |
| 2019-01-30 | 1.75 | 1.99 | 2.21 | 1.93 |
| 2019-01-31 | 1.75 | 1.99 | 2.21 | 1.86 |
| 2019-02-01 | 1.75 | 1.99 | 2.21 | 1.86 |
| 2019-02-04 | 1.75 | 1.99 | 2.2 | 1.84 |
| 2019-02-05 | 1.75 | 1.99 | 2.2 | 1.83 |
| 2019-02-06 | 1.75 | 1.99 | 2.2 | 1.82 |
| 2019-02-07 | 1.75 | 1.99 | 2.2 | 1.79 |
| 2019-02-08 | 1.75 | 1.99 | 2.2 | 1.78 |
| 2019-02-11 | 1.75 | 1.99 | 2.2 | 1.76 |
| 2019-02-12 | 1.75 | 1.99 | 2.2 | 1.78 |
| 2019-02-13 | 1.75 | 2 | 2.19 | 1.83 |
| 2019-02-14 | 1.75 | 2 | 2.19 | 1.9 |
| 2019-02-15 | 1.75 | 2.01 | 2.19 | 1.93 |
| 2019-02-18 | 1.75 | 2.02 | 2.19 | 1.97 |
| 2019-02-19 | 1.75 | 2.02 | 2.19 | 1.98 |
| 2019-02-20 | 1.75 | 2.02 | 2.19 | 1.92 |
| 2019-02-21 | 1.75 | 2.02 | 2.19 | 1.95 |
| 2019-02-22 | 1.75 | 2.02 | 2.19 | 1.98 |
| 2019-02-25 | 1.75 | 2.02 | 2.2 | 1.99 |
| 2019-02-26 | 1.75 | 2.02 | 2.2 | 2 |
| 2019-02-27 | 1.75 | 2.02 | 2.2 | 2.02 |
| 2019-02-28 | 1.75 | 2.02 | 2.2 | 2.06 |
| 2019-03-01 | 1.75 | 2.03 | 2.2 | 2.07 |
| 2019-03-04 | 1.75 | 2.03 | 2.2 | 2.1 |
| 2019-03-05 | 1.75 | 2.03 | 2.2 | 2.1 |
| 2019-03-06 | 1.75 | 2.03 | 2.2 | 2.07 |
| 2019-03-07 | 1.75 | 2.03 | 2.21 | 2.06 |
| 2019-03-08 | 1.75 | 2.03 | 2.2 | 1.99 |
| 2019-03-11 | 1.75 | 2.03 | 2.2 | 1.99 |
| 2019-03-12 | 1.75 | 2.03 | 2.2 | 1.99 |
| 2019-03-13 | 1.75 | 2.03 | 2.2 | 1.96 |
| 2019-03-14 | 1.75 | 2.03 | 2.2 | 1.98 |
| 2019-03-15 | 1.75 | 2.03 | 2.2 | 2.02 |
| 2019-03-18 | 1.75 | 2.03 | 2.2 | 2.04 |
| 2019-03-19 | 1.75 | 2.03 | 2.2 | 2.05 |
| 2019-03-20 | 1.75 | 2.03 | 2.2 | 2.06 |
| 2019-03-21 | 1.75 | 2.03 | 2.2 | 1.98 |
| 2019-03-22 | 1.75 | 2.03 | 2.2 | 1.93 |
| 2019-03-25 | 1.75 | 2.02 | 2.2 | 1.87 |
| 2019-03-26 | 1.75 | 2.02 | 2.2 | 1.87 |
| 2019-03-27 | 1.75 | 2.02 | 2.2 | 1.86 |
| 2019-03-28 | 1.75 | 2.02 | 2.2 | 1.8 |
| 2019-03-29 | 1.75 | 2.02 | 2.2 | 1.83 |
| 2019-04-01 | 1.75 | 2.02 | 2.2 | 1.84 |
| 2019-04-02 | 1.75 | 2.02 | 2.2 | 1.87 |
| 2019-04-03 | 1.75 | 2.02 | 2.2 | 1.93 |
| 2019-04-04 | 1.75 | 2.02 | 2.2 | 1.94 |
| 2019-04-05 | 1.75 | 2.02 | 2.2 | 1.99 |
| 2019-04-08 | 1.75 | 2.02 | 2.2 | 1.98 |
| 2019-04-09 | 1.75 | 2.02 | 2.2 | 1.97 |
| 2019-04-10 | 1.75 | 2.02 | 2.2 | 1.97 |
| 2019-04-11 | 1.75 | 2.02 | 2.2 | 1.93 |
| 2019-04-12 | 1.75 | 2.02 | 2.21 | 1.95 |
| 2019-04-15 | 1.75 | 2.02 | 2.21 | 1.97 |
| 2019-04-16 | 1.75 | 2.02 | 2.21 | 1.96 |
| 2019-04-17 | 1.75 | 2.02 | 2.21 | 1.98 |
| 2019-04-18 | 1.75 | 2.02 | 2.21 | 1.98 |
| 2019-04-23 | 1.75 | 2.02 | 2.22 | 1.96 |
| 2019-04-24 | 1.75 | 2.02 | 2.22 | 1.99 |
| 2019-04-25 | 1.75 | 2.02 | 2.22 | 2 |
| 2019-04-26 | 1.75 | 2.03 | 2.23 | 2.06 |
| 2019-04-29 | 1.75 | 2.04 | 2.23 | 2.06 |
| 2019-04-30 | 1.75 | 2.05 | 2.23 | 2.13 |
| 2019-05-02 | 1.75 | 2.05 | 2.23 | 2.13 |
| 2019-05-03 | 2 | 2.2 | 2.34 | 2.12 |
| 2019-05-06 | 2 | 2.21 | 2.34 | 2.09 |
| 2019-05-07 | 2 | 2.21 | 2.34 | 2.08 |
| 2019-05-09 | 2 | 2.21 | 2.34 | 2.06 |
| 2019-05-10 | 2 | 2.2 | 2.34 | 2.08 |
| 2019-05-13 | 2 | 2.2 | 2.33 | 2.05 |
| 2019-05-14 | 2 | 2.2 | 2.33 | 2.02 |
| 2019-05-15 | 2 | 2.2 | 2.32 | 1.95 |
| 2019-05-16 | 2 | 2.2 | 2.32 | 1.95 |
| 2019-05-17 | 2 | 2.2 | 2.32 | 1.96 |
| 2019-05-20 | 2 | 2.2 | 2.32 | 1.97 |
| 2019-05-21 | 2 | 2.2 | 2.32 | 1.96 |
| 2019-05-22 | 2 | 2.2 | 2.32 | 1.92 |
| 2019-05-23 | 2 | 2.19 | 2.31 | 1.88 |
| 2019-05-24 | 2 | 2.19 | 2.31 | 1.88 |
| 2019-05-27 | 2 | 2.19 | 2.31 | 1.9 |
| 2019-05-28 | 2 | 2.19 | 2.31 | 1.88 |
| 2019-05-29 | 2 | 2.19 | 2.31 | 1.87 |
| 2019-05-30 | 2 | 2.19 | 2.31 | 1.86 |
| 2019-05-31 | 2 | 2.19 | 2.31 | 1.79 |
| 2019-06-03 | 2 | 2.19 | 2.31 | 1.77 |
| 2019-06-04 | 2 | 2.18 | 2.3 | 1.78 |
| 2019-06-05 | 2 | 2.18 | 2.3 | 1.82 |
| 2019-06-06 | 2 | 2.18 | 2.3 | 1.79 |
| 2019-06-07 | 2 | 2.18 | 2.3 | 1.8 |
| 2019-06-10 | 2 | 2.17 | 2.29 | 1.79 |
| 2019-06-11 | 2 | 2.17 | 2.29 | 1.81 |
| 2019-06-12 | 2 | 2.17 | 2.29 | 1.77 |
| 2019-06-13 | 2 | 2.17 | 2.29 | 1.73 |
| 2019-06-14 | 2 | 2.17 | 2.29 | 1.68 |
| 2019-06-17 | 2 | 2.17 | 2.29 | 1.7 |
| 2019-06-18 | 2 | 2.17 | 2.29 | 1.66 |
| 2019-06-19 | 2 | 2.17 | 2.29 | 1.66 |
| 2019-06-20 | 2 | 2.17 | 2.29 | 1.65 |
| 2019-06-21 | 2 | 2.17 | 2.29 | 1.67 |
| 2019-06-24 | 2 | 2.17 | 2.29 | 1.68 |
| 2019-06-25 | 2 | 2.17 | 2.29 | 1.68 |
| 2019-06-26 | 2 | 2.17 | 2.29 | 1.69 |
| 2019-06-27 | 2 | 2.17 | 2.29 | 1.72 |
| 2019-06-28 | 2 | 2.17 | 2.29 | 1.69 |
| 2019-07-01 | 2 | 2.17 | 2.29 | 1.68 |
| 2019-07-02 | 2 | 2.17 | 2.29 | 1.67 |
| 2019-07-03 | 2 | 2.17 | 2.29 | 1.59 |
| 2019-07-04 | 2 | 2.17 | 2.29 | 1.59 |
| 2019-07-08 | 2 | 2.17 | 2.29 | 1.63 |
| 2019-07-09 | 2 | 2.17 | 2.28 | 1.6 |
| 2019-07-10 | 2 | 2.17 | 2.28 | 1.63 |
| 2019-07-11 | 2 | 2.17 | 2.28 | 1.62 |
| 2019-07-12 | 2 | 2.17 | 2.28 | 1.72 |
| 2019-07-15 | 2 | 2.16 | 2.28 | 1.7 |
| 2019-07-16 | 2 | 2.16 | 2.28 | 1.7 |
| 2019-07-17 | 2 | 2.16 | 2.28 | 1.7 |
| 2019-07-18 | 2 | 2.16 | 2.28 | 1.7 |
| 2019-07-19 | 2 | 2.16 | 2.28 | 1.7 |